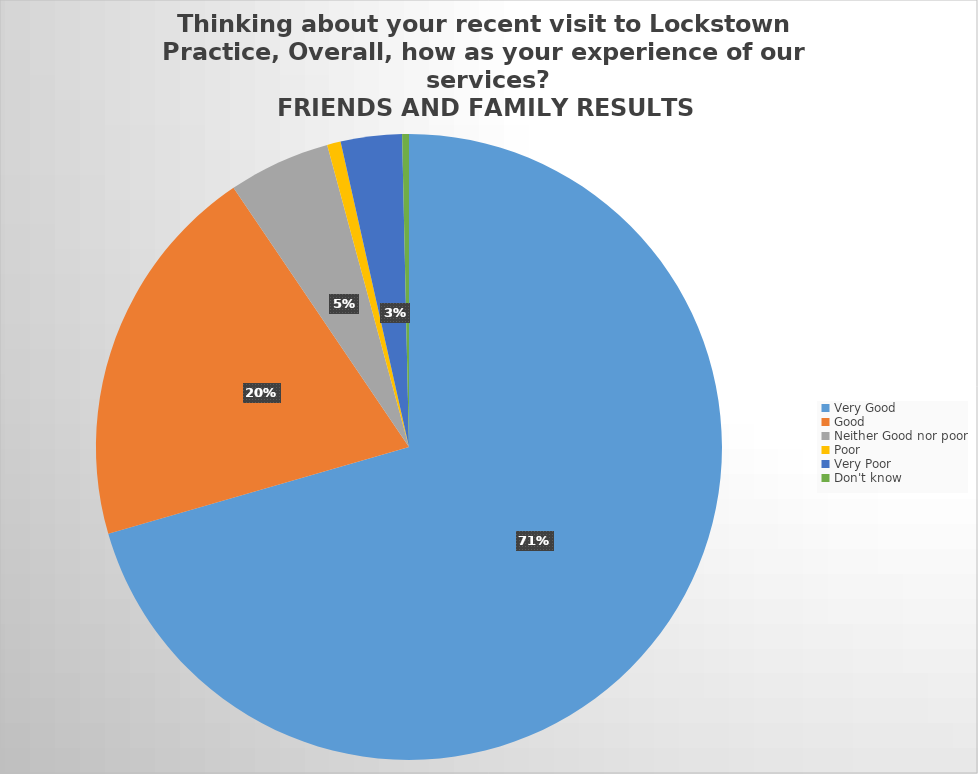
| Category | Responses |
|---|---|
| Very Good | 201 |
| Good | 57 |
| Neither Good nor poor | 15 |
| Poor | 2 |
| Very Poor | 9 |
| Don't know  | 1 |